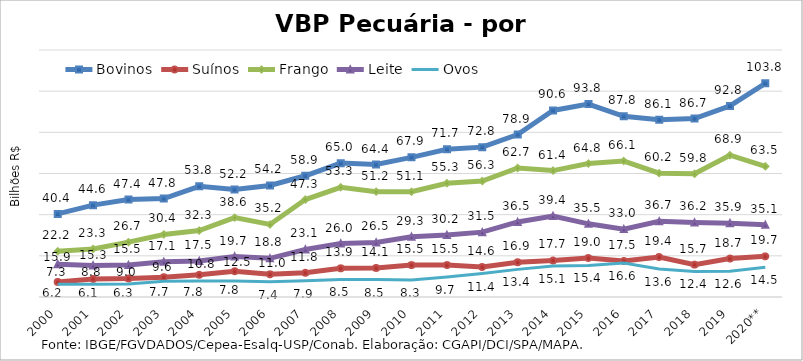
| Category | Bovinos | Suínos | Frango | Leite | Ovos |
|---|---|---|---|---|---|
| 2000 | 40.37 | 7.31 | 22.214 | 15.946 | 6.235 |
| 2001 | 44.625 | 8.769 | 23.348 | 15.344 | 6.144 |
| 2002 | 47.356 | 8.988 | 26.651 | 15.537 | 6.33 |
| 2003 | 47.794 | 9.606 | 30.385 | 17.11 | 7.657 |
| 2004 | 53.774 | 10.8 | 32.265 | 17.487 | 7.76 |
| 2005 | 52.207 | 12.522 | 38.574 | 19.668 | 7.813 |
| 2006 | 54.204 | 11.015 | 35.239 | 18.786 | 7.421 |
| 2007 | 58.907 | 11.778 | 47.348 | 23.095 | 7.887 |
| 2008 | 65.04 | 13.946 | 53.298 | 25.981 | 8.518 |
| 2009 | 64.362 | 14.098 | 51.174 | 26.488 | 8.493 |
| 2010 | 67.857 | 15.509 | 51.112 | 29.252 | 8.261 |
| 2011 | 71.735 | 15.533 | 55.28 | 30.155 | 9.734 |
| 2012 | 72.804 | 14.585 | 56.312 | 31.511 | 11.411 |
| 2013 | 78.894 | 16.887 | 62.676 | 36.464 | 13.42 |
| 2014 | 90.635 | 17.737 | 61.408 | 39.377 | 15.078 |
| 2015 | 93.755 | 18.955 | 64.828 | 35.544 | 15.353 |
| 2016 | 87.759 | 17.493 | 66.055 | 32.981 | 16.551 |
| 2017 | 86.12 | 19.419 | 60.165 | 36.748 | 13.642 |
| 2018 | 86.697 | 15.726 | 59.837 | 36.201 | 12.406 |
| 2019 | 92.833 | 18.693 | 68.896 | 35.862 | 12.559 |
| 2020** | 103.819 | 19.741 | 63.486 | 35.098 | 14.503 |